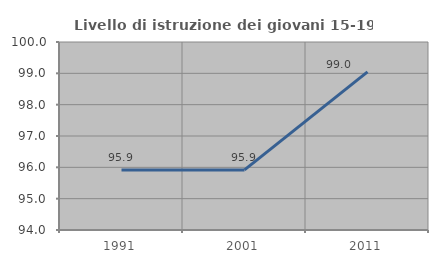
| Category | Livello di istruzione dei giovani 15-19 anni |
|---|---|
| 1991.0 | 95.918 |
| 2001.0 | 95.918 |
| 2011.0 | 99.045 |